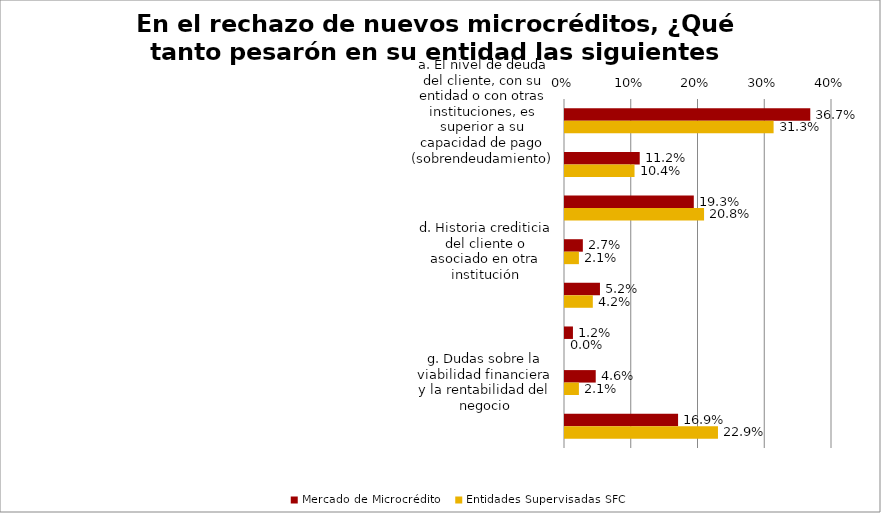
| Category | Mercado de Microcrédito | Entidades Supervisadas SFC |
|---|---|---|
| a. El nivel de deuda del cliente, con su entidad o con otras instituciones, es superior a su capacidad de pago (sobrendeudamiento) | 0.367 | 0.312 |
| b. Crédito con más de tres entidades | 0.112 | 0.104 |
| c. Mala historia crediticia | 0.193 | 0.208 |
| d. Historia crediticia del cliente o asociado en otra institución | 0.027 | 0.021 |
| e. Poco tiempo de creada la microempresa | 0.052 | 0.042 |
| f. Por sector productivo al cual pertenece el aplicante de crédito o del cual deriva sus principales fuentes de ingreso | 0.012 | 0 |
| g. Dudas sobre la viabilidad financiera y la rentabilidad del negocio | 0.046 | 0.021 |
| h. Capacidad de pago del cliente | 0.169 | 0.229 |